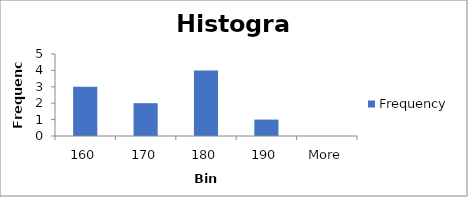
| Category | Frequency |
|---|---|
| 160 | 3 |
| 170 | 2 |
| 180 | 4 |
| 190 | 1 |
| More | 0 |